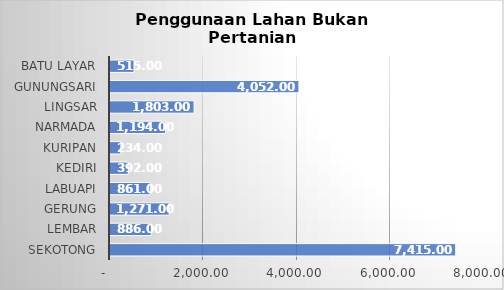
| Category | Series 0 |
|---|---|
| SEKOTONG | 7415 |
| LEMBAR | 886 |
| GERUNG | 1271 |
| LABUAPI | 861 |
|  KEDIRI | 392 |
| KURIPAN | 234 |
|  NARMADA | 1194 |
|  LINGSAR | 1803 |
|  GUNUNGSARI | 4052 |
|  BATU LAYAR | 515 |